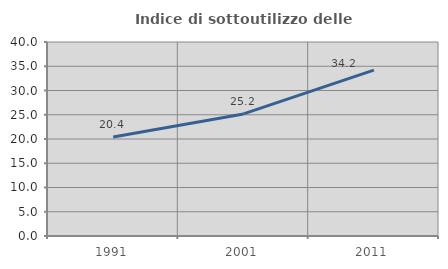
| Category | Indice di sottoutilizzo delle abitazioni  |
|---|---|
| 1991.0 | 20.403 |
| 2001.0 | 25.17 |
| 2011.0 | 34.215 |